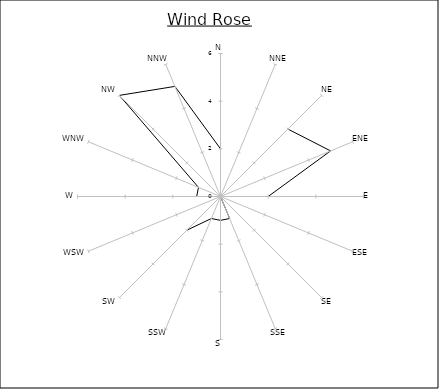
| Category | Series 0 |
|---|---|
| N | 2 |
| NNE | 0 |
| NE | 4 |
| ENE | 5 |
| E | 2 |
| ESE | 0 |
| SE | 0 |
| SSE | 1 |
| S | 1 |
| SSW | 1 |
| SW | 2 |
| WSW | 0 |
| W | 1 |
| WNW | 1 |
| NW | 6 |
| NNW | 5 |